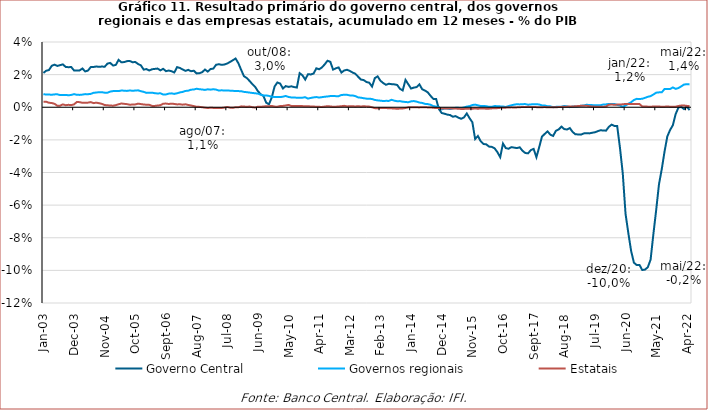
| Category | Governo Central | Governos regionais | Estatais |
|---|---|---|---|
| 2003-01-01 | 0.021 | 0.008 | 0.003 |
| 2003-02-01 | 0.022 | 0.008 | 0.003 |
| 2003-03-01 | 0.023 | 0.008 | 0.003 |
| 2003-04-01 | 0.025 | 0.008 | 0.003 |
| 2003-05-01 | 0.026 | 0.008 | 0.002 |
| 2003-06-01 | 0.025 | 0.008 | 0.001 |
| 2003-07-01 | 0.026 | 0.007 | 0.001 |
| 2003-08-01 | 0.026 | 0.008 | 0.002 |
| 2003-09-01 | 0.025 | 0.008 | 0.001 |
| 2003-10-01 | 0.025 | 0.007 | 0.001 |
| 2003-11-01 | 0.025 | 0.008 | 0.001 |
| 2003-12-01 | 0.023 | 0.008 | 0.002 |
| 2004-01-01 | 0.023 | 0.008 | 0.003 |
| 2004-02-01 | 0.023 | 0.008 | 0.003 |
| 2004-03-01 | 0.024 | 0.008 | 0.003 |
| 2004-04-01 | 0.022 | 0.008 | 0.003 |
| 2004-05-01 | 0.022 | 0.008 | 0.003 |
| 2004-06-01 | 0.025 | 0.008 | 0.003 |
| 2004-07-01 | 0.025 | 0.009 | 0.003 |
| 2004-08-01 | 0.025 | 0.009 | 0.003 |
| 2004-09-01 | 0.025 | 0.009 | 0.002 |
| 2004-10-01 | 0.025 | 0.009 | 0.002 |
| 2004-11-01 | 0.025 | 0.009 | 0.001 |
| 2004-12-01 | 0.027 | 0.009 | 0.001 |
| 2005-01-01 | 0.027 | 0.01 | 0.001 |
| 2005-02-01 | 0.026 | 0.01 | 0.001 |
| 2005-03-01 | 0.026 | 0.01 | 0.001 |
| 2005-04-01 | 0.029 | 0.01 | 0.002 |
| 2005-05-01 | 0.028 | 0.01 | 0.002 |
| 2005-06-01 | 0.028 | 0.01 | 0.002 |
| 2005-07-01 | 0.028 | 0.01 | 0.002 |
| 2005-08-01 | 0.028 | 0.01 | 0.002 |
| 2005-09-01 | 0.028 | 0.01 | 0.002 |
| 2005-10-01 | 0.028 | 0.01 | 0.002 |
| 2005-11-01 | 0.027 | 0.01 | 0.002 |
| 2005-12-01 | 0.026 | 0.01 | 0.002 |
| 2006-01-01 | 0.023 | 0.009 | 0.002 |
| 2006-02-01 | 0.023 | 0.009 | 0.002 |
| 2006-03-01 | 0.023 | 0.009 | 0.002 |
| 2006-04-01 | 0.023 | 0.009 | 0.001 |
| 2006-05-01 | 0.024 | 0.009 | 0.001 |
| 2006-06-01 | 0.024 | 0.008 | 0.001 |
| 2006-07-01 | 0.023 | 0.009 | 0.001 |
| 2006-08-01 | 0.024 | 0.008 | 0.002 |
| 2006-09-01 | 0.022 | 0.008 | 0.002 |
| 2006-10-01 | 0.022 | 0.008 | 0.002 |
| 2006-11-01 | 0.022 | 0.009 | 0.002 |
| 2006-12-01 | 0.021 | 0.008 | 0.002 |
| 2007-01-01 | 0.025 | 0.009 | 0.002 |
| 2007-02-01 | 0.024 | 0.009 | 0.002 |
| 2007-03-01 | 0.023 | 0.009 | 0.002 |
| 2007-04-01 | 0.022 | 0.01 | 0.002 |
| 2007-05-01 | 0.023 | 0.01 | 0.001 |
| 2007-06-01 | 0.022 | 0.011 | 0.001 |
| 2007-07-01 | 0.022 | 0.011 | 0.001 |
| 2007-08-01 | 0.021 | 0.011 | 0 |
| 2007-09-01 | 0.021 | 0.011 | 0 |
| 2007-10-01 | 0.021 | 0.011 | 0 |
| 2007-11-01 | 0.023 | 0.011 | 0 |
| 2007-12-01 | 0.022 | 0.011 | 0 |
| 2008-01-01 | 0.023 | 0.011 | 0 |
| 2008-02-01 | 0.024 | 0.011 | 0 |
| 2008-03-01 | 0.026 | 0.011 | -0.001 |
| 2008-04-01 | 0.026 | 0.01 | -0.001 |
| 2008-05-01 | 0.026 | 0.01 | 0 |
| 2008-06-01 | 0.026 | 0.01 | 0 |
| 2008-07-01 | 0.027 | 0.01 | 0 |
| 2008-08-01 | 0.028 | 0.01 | 0 |
| 2008-09-01 | 0.029 | 0.01 | 0 |
| 2008-10-01 | 0.03 | 0.01 | 0 |
| 2008-11-01 | 0.027 | 0.01 | 0 |
| 2008-12-01 | 0.023 | 0.01 | 0.001 |
| 2009-01-01 | 0.019 | 0.009 | 0 |
| 2009-02-01 | 0.018 | 0.009 | 0 |
| 2009-03-01 | 0.016 | 0.009 | 0 |
| 2009-04-01 | 0.014 | 0.009 | 0 |
| 2009-05-01 | 0.013 | 0.009 | 0 |
| 2009-06-01 | 0.01 | 0.008 | 0 |
| 2009-07-01 | 0.008 | 0.008 | 0 |
| 2009-08-01 | 0.007 | 0.007 | 0 |
| 2009-09-01 | 0.003 | 0.007 | 0.001 |
| 2009-10-01 | 0.002 | 0.007 | 0.001 |
| 2009-11-01 | 0.006 | 0.006 | 0.001 |
| 2009-12-01 | 0.013 | 0.006 | 0 |
| 2010-01-01 | 0.015 | 0.006 | 0 |
| 2010-02-01 | 0.015 | 0.006 | 0.001 |
| 2010-03-01 | 0.012 | 0.006 | 0.001 |
| 2010-04-01 | 0.013 | 0.007 | 0.001 |
| 2010-05-01 | 0.012 | 0.006 | 0.001 |
| 2010-06-01 | 0.013 | 0.006 | 0.001 |
| 2010-07-01 | 0.012 | 0.006 | 0.001 |
| 2010-08-01 | 0.012 | 0.006 | 0.001 |
| 2010-09-01 | 0.021 | 0.006 | 0.001 |
| 2010-10-01 | 0.02 | 0.006 | 0.001 |
| 2010-11-01 | 0.017 | 0.006 | 0.001 |
| 2010-12-01 | 0.02 | 0.005 | 0.001 |
| 2011-01-01 | 0.02 | 0.006 | 0 |
| 2011-02-01 | 0.021 | 0.006 | 0 |
| 2011-03-01 | 0.024 | 0.006 | 0 |
| 2011-04-01 | 0.023 | 0.006 | 0 |
| 2011-05-01 | 0.024 | 0.006 | 0 |
| 2011-06-01 | 0.026 | 0.006 | 0 |
| 2011-07-01 | 0.029 | 0.007 | 0.001 |
| 2011-08-01 | 0.028 | 0.007 | 0.001 |
| 2011-09-01 | 0.023 | 0.007 | 0 |
| 2011-10-01 | 0.024 | 0.007 | 0 |
| 2011-11-01 | 0.024 | 0.007 | 0 |
| 2011-12-01 | 0.021 | 0.008 | 0.001 |
| 2012-01-01 | 0.023 | 0.008 | 0.001 |
| 2012-02-01 | 0.023 | 0.008 | 0.001 |
| 2012-03-01 | 0.022 | 0.007 | 0.001 |
| 2012-04-01 | 0.021 | 0.007 | 0.001 |
| 2012-05-01 | 0.021 | 0.007 | 0 |
| 2012-06-01 | 0.019 | 0.006 | 0.001 |
| 2012-07-01 | 0.017 | 0.006 | 0 |
| 2012-08-01 | 0.017 | 0.006 | 0.001 |
| 2012-09-01 | 0.015 | 0.005 | 0 |
| 2012-10-01 | 0.015 | 0.005 | 0 |
| 2012-11-01 | 0.013 | 0.005 | 0 |
| 2012-12-01 | 0.018 | 0.004 | -0.001 |
| 2013-01-01 | 0.019 | 0.004 | -0.001 |
| 2013-02-01 | 0.016 | 0.004 | -0.001 |
| 2013-03-01 | 0.015 | 0.004 | 0 |
| 2013-04-01 | 0.014 | 0.004 | 0 |
| 2013-05-01 | 0.014 | 0.004 | -0.001 |
| 2013-06-01 | 0.014 | 0.005 | -0.001 |
| 2013-07-01 | 0.014 | 0.004 | -0.001 |
| 2013-08-01 | 0.014 | 0.004 | -0.001 |
| 2013-09-01 | 0.011 | 0.004 | -0.001 |
| 2013-10-01 | 0.01 | 0.003 | -0.001 |
| 2013-11-01 | 0.017 | 0.003 | 0 |
| 2013-12-01 | 0.014 | 0.003 | 0 |
| 2014-01-01 | 0.011 | 0.004 | 0 |
| 2014-02-01 | 0.012 | 0.004 | 0 |
| 2014-03-01 | 0.012 | 0.003 | 0 |
| 2014-04-01 | 0.014 | 0.003 | 0 |
| 2014-05-01 | 0.011 | 0.003 | 0 |
| 2014-06-01 | 0.01 | 0.002 | 0 |
| 2014-07-01 | 0.009 | 0.002 | 0 |
| 2014-08-01 | 0.007 | 0.002 | 0 |
| 2014-09-01 | 0.005 | 0.001 | 0 |
| 2014-10-01 | 0.005 | 0 | 0 |
| 2014-11-01 | -0.001 | 0 | 0 |
| 2014-12-01 | -0.004 | -0.001 | -0.001 |
| 2015-01-01 | -0.004 | -0.001 | -0.001 |
| 2015-02-01 | -0.005 | -0.001 | -0.001 |
| 2015-03-01 | -0.005 | -0.001 | -0.001 |
| 2015-04-01 | -0.006 | -0.001 | -0.001 |
| 2015-05-01 | -0.005 | 0 | -0.001 |
| 2015-06-01 | -0.006 | 0 | -0.001 |
| 2015-07-01 | -0.007 | -0.001 | -0.001 |
| 2015-08-01 | -0.006 | 0 | -0.001 |
| 2015-09-01 | -0.004 | 0 | -0.001 |
| 2015-10-01 | -0.007 | 0.001 | -0.001 |
| 2015-11-01 | -0.009 | 0.001 | -0.001 |
| 2015-12-01 | -0.019 | 0.002 | -0.001 |
| 2016-01-01 | -0.018 | 0.001 | -0.001 |
| 2016-02-01 | -0.021 | 0.001 | -0.001 |
| 2016-03-01 | -0.023 | 0.001 | -0.001 |
| 2016-04-01 | -0.023 | 0.001 | -0.001 |
| 2016-05-01 | -0.024 | 0 | -0.001 |
| 2016-06-01 | -0.024 | 0 | -0.001 |
| 2016-07-01 | -0.025 | 0.001 | -0.001 |
| 2016-08-01 | -0.028 | 0.001 | -0.001 |
| 2016-09-01 | -0.031 | 0.001 | 0 |
| 2016-10-01 | -0.022 | 0 | 0 |
| 2016-11-01 | -0.025 | 0 | 0 |
| 2016-12-01 | -0.025 | 0.001 | 0 |
| 2017-01-01 | -0.024 | 0.001 | 0 |
| 2017-02-01 | -0.025 | 0.002 | 0 |
| 2017-03-01 | -0.025 | 0.002 | 0 |
| 2017-04-01 | -0.025 | 0.002 | 0 |
| 2017-05-01 | -0.027 | 0.002 | 0 |
| 2017-06-01 | -0.028 | 0.002 | 0 |
| 2017-07-01 | -0.028 | 0.002 | 0 |
| 2017-08-01 | -0.026 | 0.002 | 0 |
| 2017-09-01 | -0.026 | 0.002 | 0 |
| 2017-10-01 | -0.031 | 0.002 | 0 |
| 2017-11-01 | -0.024 | 0.002 | 0 |
| 2017-12-01 | -0.018 | 0.001 | 0 |
| 2018-01-01 | -0.016 | 0.001 | 0 |
| 2018-02-01 | -0.015 | 0.001 | 0 |
| 2018-03-01 | -0.017 | 0.001 | 0 |
| 2018-04-01 | -0.018 | 0 | 0 |
| 2018-05-01 | -0.014 | 0 | 0 |
| 2018-06-01 | -0.014 | 0 | 0 |
| 2018-07-01 | -0.012 | 0 | 0 |
| 2018-08-01 | -0.013 | 0.001 | 0 |
| 2018-09-01 | -0.014 | 0.001 | 0 |
| 2018-10-01 | -0.013 | 0 | 0.001 |
| 2018-11-01 | -0.015 | 0 | 0 |
| 2018-12-01 | -0.017 | 0 | 0.001 |
| 2019-01-01 | -0.017 | 0.001 | 0.001 |
| 2019-02-01 | -0.017 | 0.001 | 0.001 |
| 2019-03-01 | -0.016 | 0.001 | 0.001 |
| 2019-04-01 | -0.016 | 0.002 | 0.001 |
| 2019-05-01 | -0.016 | 0.001 | 0.001 |
| 2019-06-01 | -0.016 | 0.001 | 0 |
| 2019-07-01 | -0.015 | 0.001 | 0 |
| 2019-08-01 | -0.015 | 0.001 | 0 |
| 2019-09-01 | -0.014 | 0.001 | 0 |
| 2019-10-01 | -0.014 | 0.002 | 0 |
| 2019-11-01 | -0.014 | 0.002 | 0 |
| 2019-12-01 | -0.012 | 0.002 | 0.002 |
| 2020-01-01 | -0.011 | 0.002 | 0.002 |
| 2020-02-01 | -0.011 | 0.002 | 0.002 |
| 2020-03-01 | -0.012 | 0.001 | 0.002 |
| 2020-04-01 | -0.025 | 0.001 | 0.002 |
| 2020-05-01 | -0.04 | 0 | 0.002 |
| 2020-06-01 | -0.065 | 0.001 | 0.002 |
| 2020-07-01 | -0.077 | 0.002 | 0.002 |
| 2020-08-01 | -0.088 | 0.003 | 0.002 |
| 2020-09-01 | -0.095 | 0.004 | 0.002 |
| 2020-10-01 | -0.097 | 0.005 | 0.002 |
| 2020-11-01 | -0.097 | 0.005 | 0.002 |
| 2020-12-01 | -0.1 | 0.005 | 0 |
| 2021-01-01 | -0.1 | 0.006 | 0 |
| 2021-02-01 | -0.098 | 0.006 | 0 |
| 2021-03-01 | -0.093 | 0.007 | 0 |
| 2021-04-01 | -0.078 | 0.008 | 0 |
| 2021-05-01 | -0.063 | 0.009 | 0 |
| 2021-06-01 | -0.047 | 0.009 | 0 |
| 2021-07-01 | -0.038 | 0.009 | 0 |
| 2021-08-01 | -0.027 | 0.011 | 0 |
| 2021-09-01 | -0.018 | 0.011 | 0 |
| 2021-10-01 | -0.014 | 0.011 | 0 |
| 2021-11-01 | -0.011 | 0.012 | 0 |
| 2021-12-01 | -0.004 | 0.011 | 0 |
| 2022-01-01 | 0 | 0.012 | 0.001 |
| 2022-02-01 | 0 | 0.013 | 0.001 |
| 2022-03-01 | -0.001 | 0.014 | 0.001 |
| 2022-04-01 | 0 | 0.014 | 0.001 |
| 2022-05-01 | -0.002 | 0.014 | 0.001 |